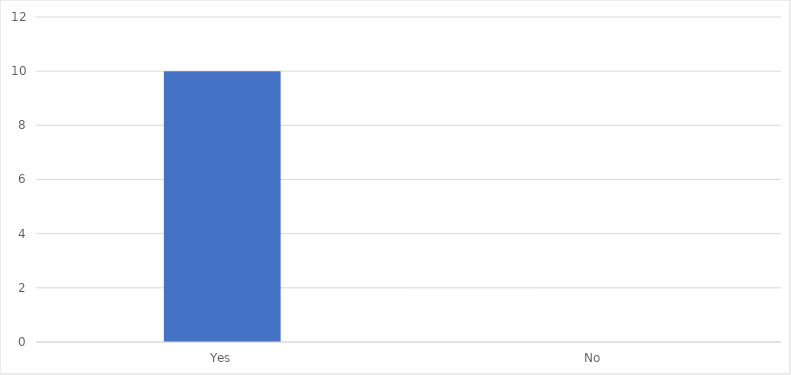
| Category | Number of Responses |
|---|---|
| Yes | 10 |
| No | 0 |